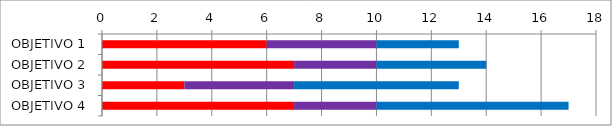
| Category | Series 0 | Series 3 | Series 1 |
|---|---|---|---|
| OBJETIVO 1 | 6 | 4 | 3 |
| OBJETIVO 2 | 7 | 3 | 4 |
| OBJETIVO 3 | 3 | 4 | 6 |
| OBJETIVO 4 | 7 | 3 | 7 |